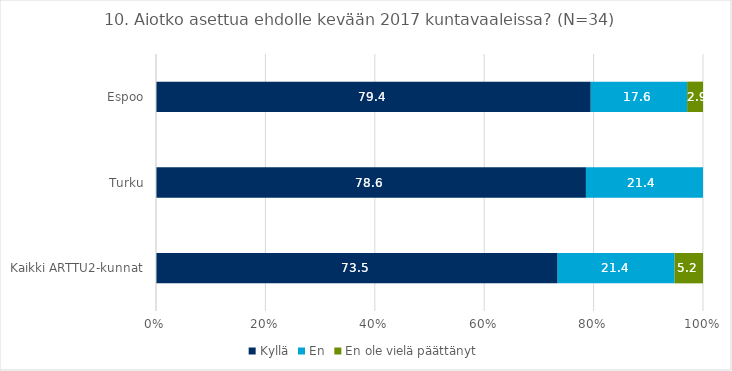
| Category | Kyllä | En | En ole vielä päättänyt |
|---|---|---|---|
| Kaikki ARTTU2-kunnat | 73.5 | 21.4 | 5.2 |
| Turku | 78.6 | 21.4 | 0 |
| Espoo | 79.4 | 17.6 | 2.9 |